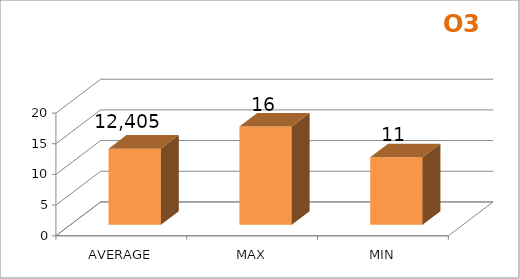
| Category | Series 0 |
|---|---|
| AVERAGE | 12.406 |
| MAX | 16 |
| MIN | 11 |